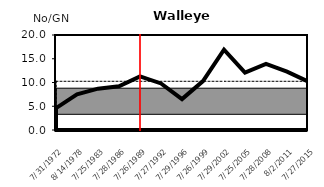
| Category | 3rd | 1st | No/Net | AVG |
|---|---|---|---|---|
| 7/31/72 | 8.8 | 3.3 | 4.6 | 10.254 |
| 8/14/78 | 8.8 | 3.3 | 7.5 | 10.254 |
| 7/25/83 | 8.8 | 3.3 | 8.7 | 10.254 |
| 7/28/86 | 8.8 | 3.3 | 9.2 | 10.254 |
| 7/26/89 | 8.8 | 3.3 | 11.3 | 10.254 |
| 7/27/92 | 8.8 | 3.3 | 9.8 | 10.254 |
| 7/29/96 | 8.8 | 3.3 | 6.5 | 10.254 |
| 7/26/99 | 8.8 | 3.3 | 10.3 | 10.254 |
| 7/29/02 | 8.8 | 3.3 | 16.9 | 10.254 |
| 7/25/05 | 8.8 | 3.3 | 12.1 | 10.254 |
| 7/28/08 | 8.8 | 3.3 | 13.9 | 10.254 |
| 8/2/11 | 8.8 | 3.3 | 12.3 | 10.254 |
| 7/27/15 | 8.8 | 3.3 | 10.2 | 10.254 |